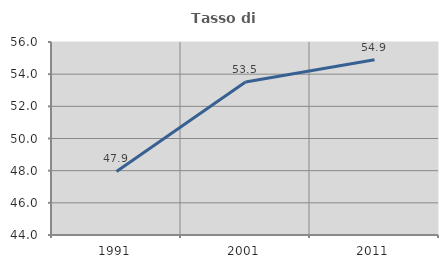
| Category | Tasso di occupazione   |
|---|---|
| 1991.0 | 47.95 |
| 2001.0 | 53.508 |
| 2011.0 | 54.897 |